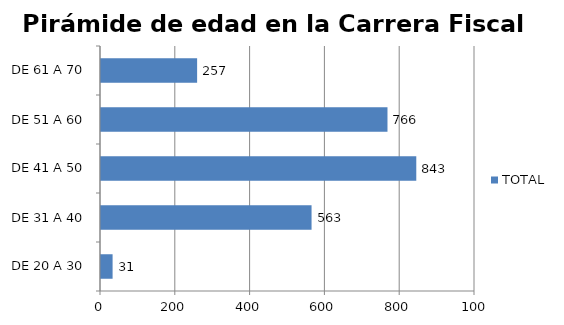
| Category | TOTAL |
|---|---|
| DE 20 A 30 | 31 |
| DE 31 A 40 | 563 |
| DE 41 A 50 | 843 |
| DE 51 A 60 | 766 |
| DE 61 A 70 | 257 |